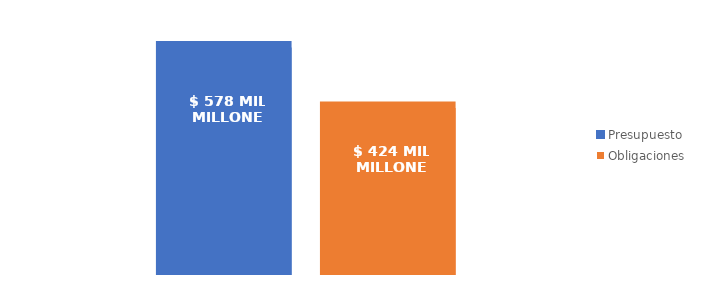
| Category | Presupuesto | Obligaciones |
|---|---|---|
| Total | 578499803922.423 | 424038826930.435 |